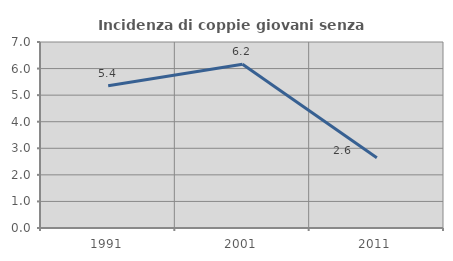
| Category | Incidenza di coppie giovani senza figli |
|---|---|
| 1991.0 | 5.351 |
| 2001.0 | 6.164 |
| 2011.0 | 2.645 |